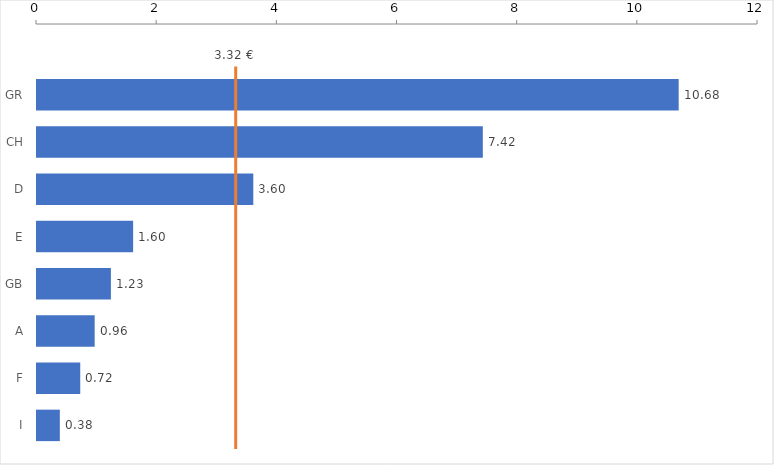
| Category | Ø-Kosten |
|---|---|
|  | 0 |
| GR | 10.68 |
| CH | 7.42 |
| D | 3.6 |
| E | 1.6 |
| GB | 1.23 |
| A | 0.96 |
| F | 0.72 |
| I | 0.38 |